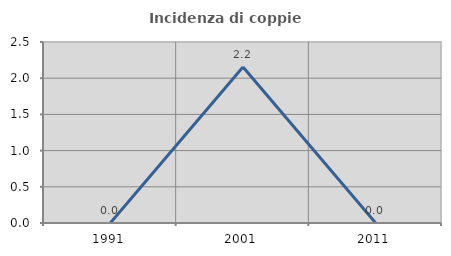
| Category | Incidenza di coppie miste |
|---|---|
| 1991.0 | 0 |
| 2001.0 | 2.155 |
| 2011.0 | 0 |